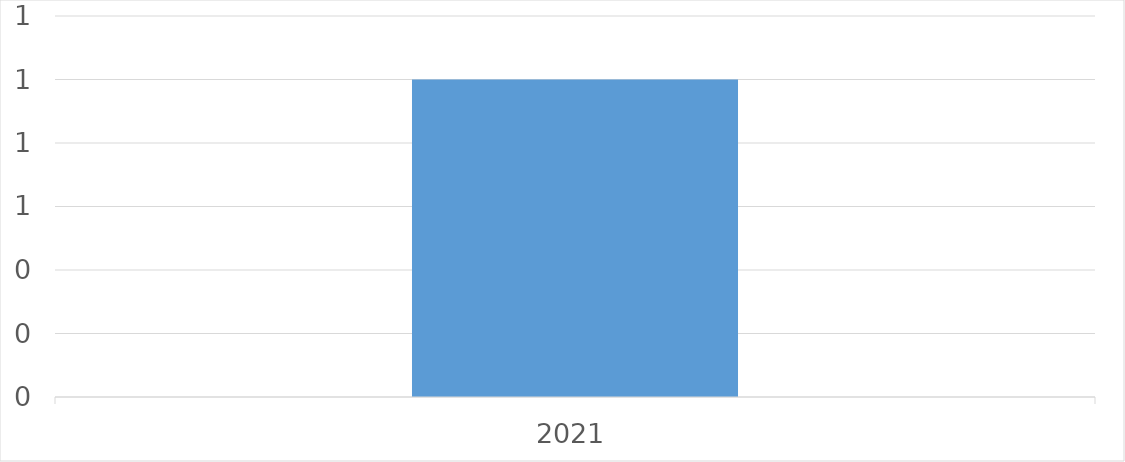
| Category | Series 0 |
|---|---|
| 2021 | 1 |